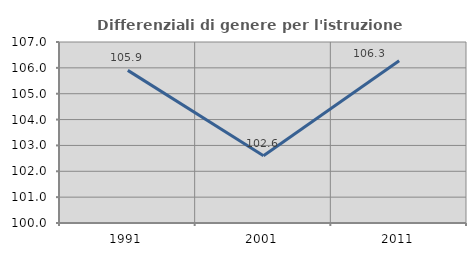
| Category | Differenziali di genere per l'istruzione superiore |
|---|---|
| 1991.0 | 105.903 |
| 2001.0 | 102.601 |
| 2011.0 | 106.274 |